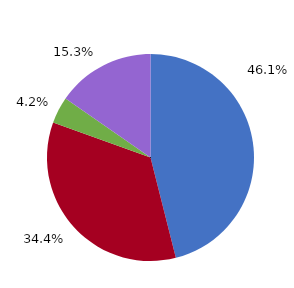
| Category | 2018 |
|---|---|
| Vorl.güter/Energie | 16738.652 |
| Investitionsgüterproduzenten | 12516.161 |
| Gebrauchsgüterproduzenten | 1515.134 |
| Verbrauchsgüterproduzenten | 5570.422 |